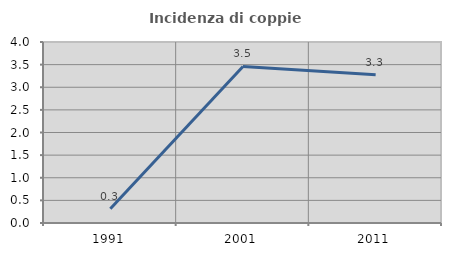
| Category | Incidenza di coppie miste |
|---|---|
| 1991.0 | 0.313 |
| 2001.0 | 3.46 |
| 2011.0 | 3.279 |